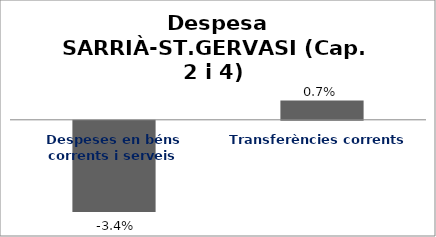
| Category | Series 0 |
|---|---|
| Despeses en béns corrents i serveis | -0.034 |
| Transferències corrents | 0.007 |